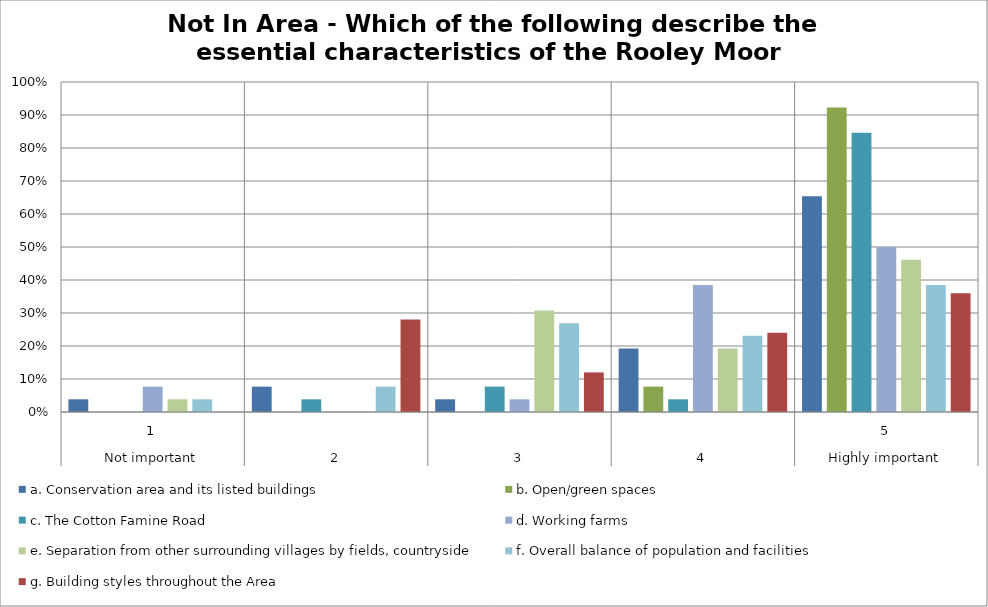
| Category | a. Conservation area and its listed buildings | b. Open/green spaces | c. The Cotton Famine Road | d. Working farms | e. Separation from other surrounding villages by fields, countryside | f. Overall balance of population and facilities | g. Building styles throughout the Area |
|---|---|---|---|---|---|---|---|
| 0 | 0.038 | 0 | 0 | 0.077 | 0.038 | 0.038 | 0 |
| 1 | 0.077 | 0 | 0.038 | 0 | 0 | 0.077 | 0.28 |
| 2 | 0.038 | 0 | 0.077 | 0.038 | 0.308 | 0.269 | 0.12 |
| 3 | 0.192 | 0.077 | 0.038 | 0.385 | 0.192 | 0.231 | 0.24 |
| 4 | 0.654 | 0.923 | 0.846 | 0.5 | 0.462 | 0.385 | 0.36 |